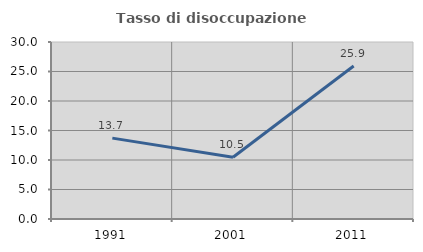
| Category | Tasso di disoccupazione giovanile  |
|---|---|
| 1991.0 | 13.71 |
| 2001.0 | 10.458 |
| 2011.0 | 25.926 |